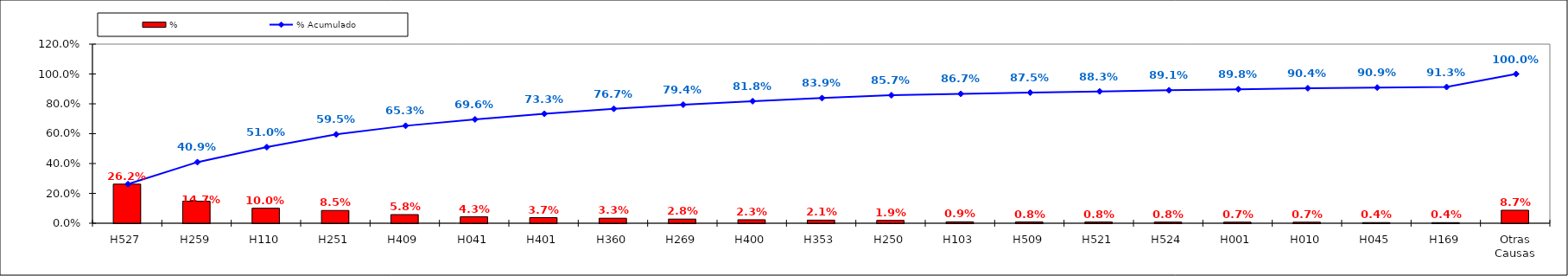
| Category | % |
|---|---|
| H527 | 0.262 |
| H259 | 0.147 |
| H110 | 0.1 |
| H251 | 0.085 |
| H409 | 0.058 |
| H041 | 0.043 |
| H401 | 0.037 |
| H360 | 0.033 |
| H269 | 0.028 |
| H400 | 0.023 |
| H353 | 0.021 |
| H250 | 0.019 |
| H103 | 0.009 |
| H509 | 0.008 |
| H521 | 0.008 |
| H524 | 0.008 |
| H001 | 0.007 |
| H010 | 0.007 |
| H045 | 0.004 |
| H169 | 0.004 |
| Otras Causas | 0.087 |